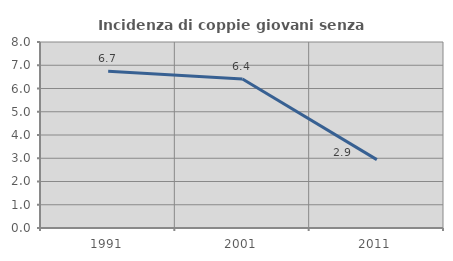
| Category | Incidenza di coppie giovani senza figli |
|---|---|
| 1991.0 | 6.746 |
| 2001.0 | 6.41 |
| 2011.0 | 2.941 |